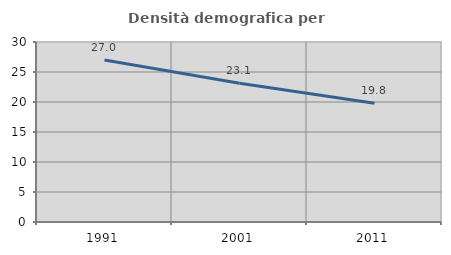
| Category | Densità demografica |
|---|---|
| 1991.0 | 27.014 |
| 2001.0 | 23.136 |
| 2011.0 | 19.793 |